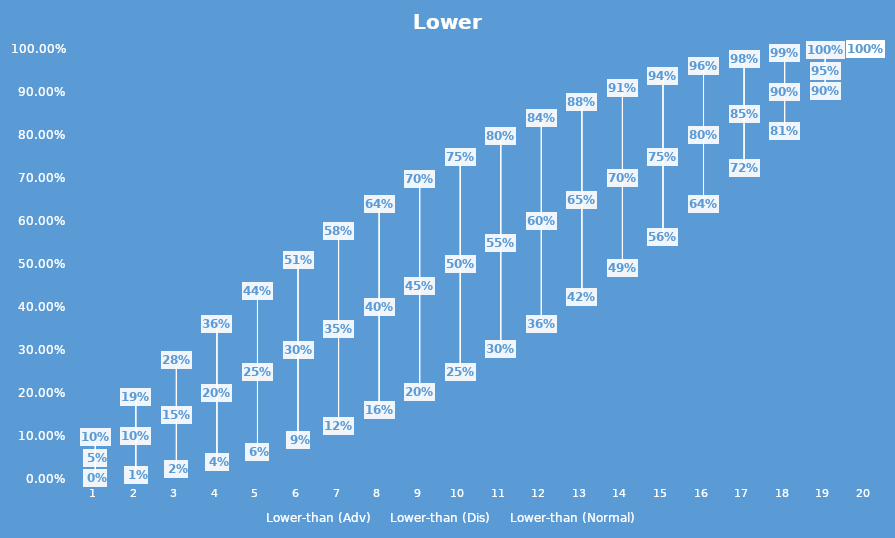
| Category | Lower-than (Adv) | Lower-than (Dis) | Lower-than (Normal) |
|---|---|---|---|
| 1.0 | 0.002 | 0.098 | 0.05 |
| 2.0 | 0.01 | 0.19 | 0.1 |
| 3.0 | 0.022 | 0.277 | 0.15 |
| 4.0 | 0.04 | 0.36 | 0.2 |
| 5.0 | 0.062 | 0.438 | 0.25 |
| 6.0 | 0.09 | 0.51 | 0.3 |
| 7.0 | 0.122 | 0.578 | 0.35 |
| 8.0 | 0.16 | 0.64 | 0.4 |
| 9.0 | 0.202 | 0.698 | 0.45 |
| 10.0 | 0.25 | 0.75 | 0.5 |
| 11.0 | 0.302 | 0.798 | 0.55 |
| 12.0 | 0.36 | 0.84 | 0.6 |
| 13.0 | 0.422 | 0.878 | 0.65 |
| 14.0 | 0.49 | 0.91 | 0.7 |
| 15.0 | 0.562 | 0.937 | 0.75 |
| 16.0 | 0.64 | 0.96 | 0.8 |
| 17.0 | 0.722 | 0.977 | 0.85 |
| 18.0 | 0.81 | 0.99 | 0.9 |
| 19.0 | 0.903 | 0.997 | 0.95 |
| 20.0 | 1 | 1 | 1 |